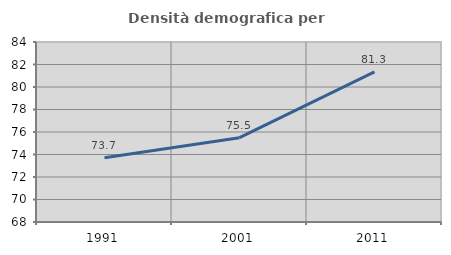
| Category | Densità demografica |
|---|---|
| 1991.0 | 73.717 |
| 2001.0 | 75.495 |
| 2011.0 | 81.348 |